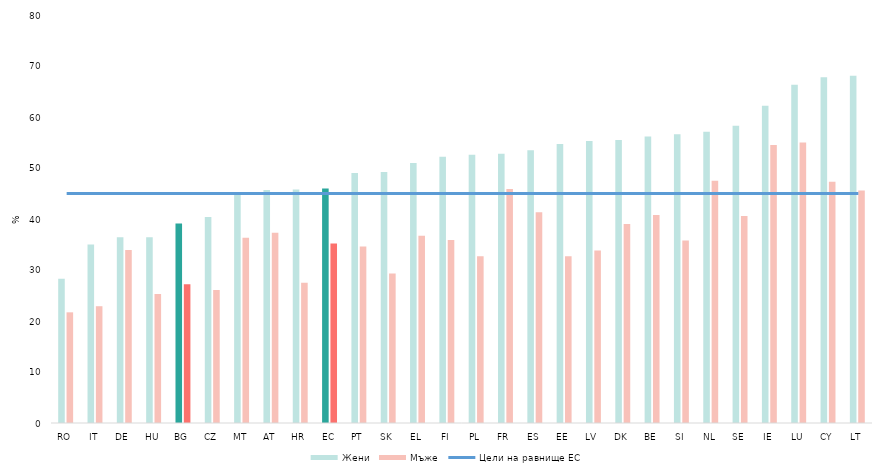
| Category | Жени | Мъже |
|---|---|---|
| RO | 28.3 | 21.7 |
| IT | 35 | 22.9 |
| DE | 36.4 | 33.9 |
| HU | 36.4 | 25.3 |
| BG | 39.1 | 27.2 |
| CZ | 40.4 | 26.1 |
| MT | 44.7 | 36.3 |
| AT | 45.7 | 37.3 |
| HR | 45.8 | 27.5 |
| ЕС | 46 | 35.2 |
| PT | 49 | 34.6 |
| SK | 49.2 | 29.3 |
| EL | 51 | 36.7 |
| FI | 52.2 | 35.9 |
| PL | 52.6 | 32.7 |
| FR | 52.8 | 45.9 |
| ES | 53.5 | 41.3 |
| EE | 54.7 | 32.7 |
| LV | 55.3 | 33.8 |
| DK | 55.5 | 39 |
| BE | 56.2 | 40.8 |
| SI | 56.6 | 35.8 |
| NL | 57.1 | 47.5 |
| SE | 58.3 | 40.6 |
| IE | 62.2 | 54.5 |
| LU | 66.3 | 55 |
| CY | 67.8 | 47.3 |
| LT | 68.1 | 45.6 |